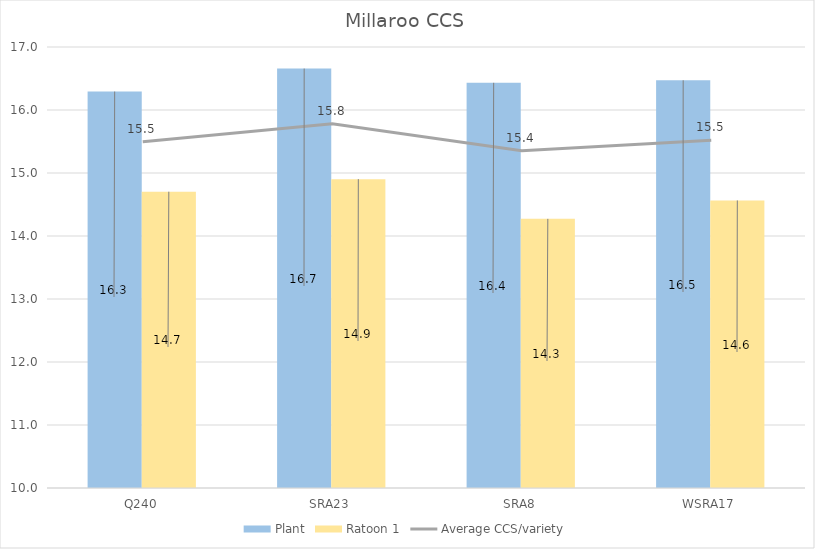
| Category | Plant | Ratoon 1 |
|---|---|---|
| Q240 | 16.293 | 14.703 |
| SRA23 | 16.658 | 14.903 |
| SRA8 | 16.432 | 14.272 |
| WSRA17 | 16.472 | 14.565 |